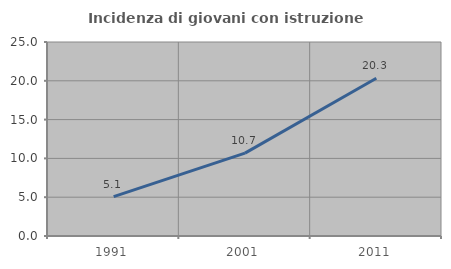
| Category | Incidenza di giovani con istruzione universitaria |
|---|---|
| 1991.0 | 5.074 |
| 2001.0 | 10.682 |
| 2011.0 | 20.335 |